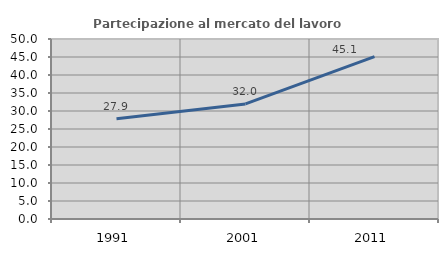
| Category | Partecipazione al mercato del lavoro  femminile |
|---|---|
| 1991.0 | 27.879 |
| 2001.0 | 31.962 |
| 2011.0 | 45.118 |